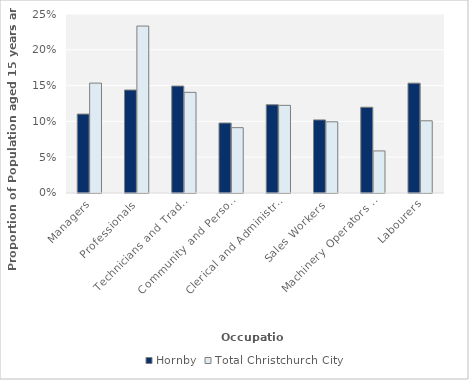
| Category | Hornby | Total Christchurch City |
|---|---|---|
| Managers | 0.11 | 0.153 |
| Professionals | 0.144 | 0.233 |
| Technicians and Trades Workers | 0.149 | 0.141 |
| Community and Personal Service Workers | 0.098 | 0.091 |
| Clerical and Administrative Workers | 0.123 | 0.122 |
| Sales Workers | 0.102 | 0.099 |
| Machinery Operators and Drivers | 0.12 | 0.059 |
| Labourers | 0.153 | 0.101 |